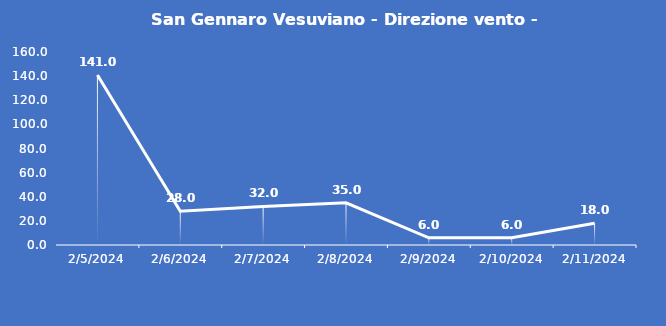
| Category | San Gennaro Vesuviano - Direzione vento - Grezzo (°N) |
|---|---|
| 2/5/24 | 141 |
| 2/6/24 | 28 |
| 2/7/24 | 32 |
| 2/8/24 | 35 |
| 2/9/24 | 6 |
| 2/10/24 | 6 |
| 2/11/24 | 18 |